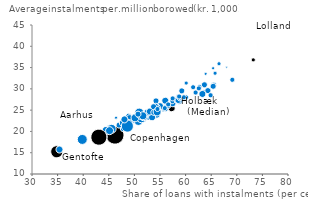
| Category | Copenhagen Frederiksberg Ballerup Brøndby Dragør Gentofte Gladsaxe Glostrup Herlev Albertslund Hvidovre Høje-Taastrup Lyngby-Taarbæk Rødovre Ishøj Tårnby Vallensbæk Furesø Allerød Fredensborg Helsingør Hillerød Hørsholm Rudersdal Egedal Frederikssund Grev |
|---|---|
| 46.2064292720321 | 19.141 |
| 43.74948794481222 | 18.816 |
| 53.246990490733516 | 24.933 |
| 56.19966291986821 | 25.818 |
| 42.278254790851285 | 19.074 |
| 34.788096925415566 | 15.276 |
| 52.63663149727503 | 23.701 |
| 54.024108417019164 | 24.579 |
| 52.193446699924216 | 24.371 |
| 57.779519547929624 | 26.707 |
| 54.0351104898731 | 23.713 |
| 57.049739228572946 | 26.231 |
| 45.27730023196215 | 20.652 |
| 54.320895299980634 | 23.922 |
| 55.60501067124296 | 25.104 |
| 53.3598359484861 | 23.438 |
| 54.845332667704824 | 25.705 |
| 48.10721754639332 | 22.326 |
| 50.54379972469607 | 23.61 |
| 47.89460088870281 | 22.057 |
| 44.46162168246338 | 20.262 |
| 51.582018004327864 | 24.283 |
| 35.30276949004437 | 15.828 |
| 39.759261127122656 | 18.192 |
| 52.32371686442673 | 24.364 |
| 55.89909777880659 | 25.564 |
| 49.562023551926856 | 22.693 |
| 54.971494579143624 | 25.966 |
| 59.51351144801025 | 28.023 |
| 50.77179942301091 | 22.483 |
| 46.92196700817854 | 21.583 |
| 51.198463640133575 | 24.346 |
| 58.62182826427579 | 28.041 |
| 57.260782543468416 | 25.477 |
| 63.57810084550412 | 29.248 |
| 64.30551935380483 | 29.652 |
| 60.04206838136897 | 28.056 |
| 63.21757992265047 | 28.872 |
| 59.576293238839604 | 28.116 |
| 64.81200376808351 | 28.586 |
| 57.41797664455086 | 26.609 |
| 73.20636326052782 | 36.827 |
| 58.579082050117606 | 27.424 |
| 65.45613209990967 | 30.909 |
| 65.30283014713947 | 30.693 |
| 69.0765077816254 | 32.183 |
| 48.83302188158715 | 23.635 |
| 57.421351933889284 | 27.128 |
| 58.260995533210426 | 27.455 |
| 51.56843677412806 | 24.389 |
| 56.48934295783712 | 26.007 |
| 51.36271607670505 | 23.376 |
| 55.9412249982676 | 27.325 |
| 57.40356821032581 | 27.832 |
| 65.33784431188377 | 34.894 |
| 67.99148653082466 | 35.123 |
| 58.478276799627324 | 27.36 |
| 60.09019253114474 | 31.396 |
| 63.66540245751845 | 30.964 |
| 66.49705164716238 | 35.936 |
| 50.85447798962824 | 24.543 |
| 46.36073431643357 | 23.278 |
| 54.217786722803794 | 27.173 |
| 61.903809665884694 | 29.196 |
| 62.70012262752645 | 30.429 |
| 49.022658465816434 | 23.3 |
| 51.715606526291204 | 23.528 |
| 50.097864136057304 | 23.225 |
| 54.15818674029197 | 25.563 |
| 52.95755835770892 | 24.756 |
| 53.786334620347084 | 24.489 |
| 65.66472716568359 | 33.787 |
| 58.778095478747694 | 27.865 |
| 47.676519258747646 | 22.067 |
| 56.5601855533032 | 26.383 |
| 51.163932861536246 | 23.747 |
| 47.69121677824516 | 20.636 |
| 51.583861064522395 | 23.755 |
| 45.47538905157594 | 20.697 |
| 53.793351055240365 | 25.349 |
| 45.103201570543 | 20.235 |
| 43.03830773880211 | 18.679 |
| 54.105100966985866 | 26.115 |
| 59.221749063148344 | 29.561 |
| 53.707653597427594 | 25.844 |
| 63.897664786075794 | 33.55 |
| 61.44330576227153 | 30.418 |
| 62.574588597347194 | 30.131 |
| 54.369944552055735 | 24.661 |
| 55.87042714014425 | 25.541 |
| 48.93576999474889 | 22.036 |
| 58.772610228909016 | 27.862 |
| 58.914011183173734 | 27.687 |
| 54.45012158883824 | 25.329 |
| 58.71876776956309 | 28.229 |
| 50.66452132233672 | 24.108 |
| 48.56824541373231 | 21.327 |
| 48.00553140459267 | 22.882 |